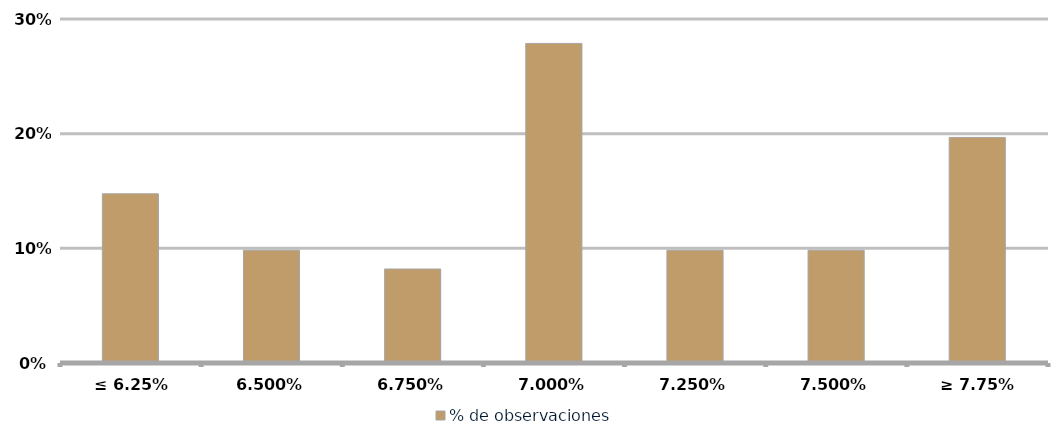
| Category | % de observaciones  |
|---|---|
| ≤ 6.25% | 0.148 |
| 6.50% | 0.098 |
| 6.75% | 0.082 |
| 7.00% | 0.279 |
| 7.25% | 0.098 |
| 7.50% | 0.098 |
| ≥ 7.75% | 0.197 |